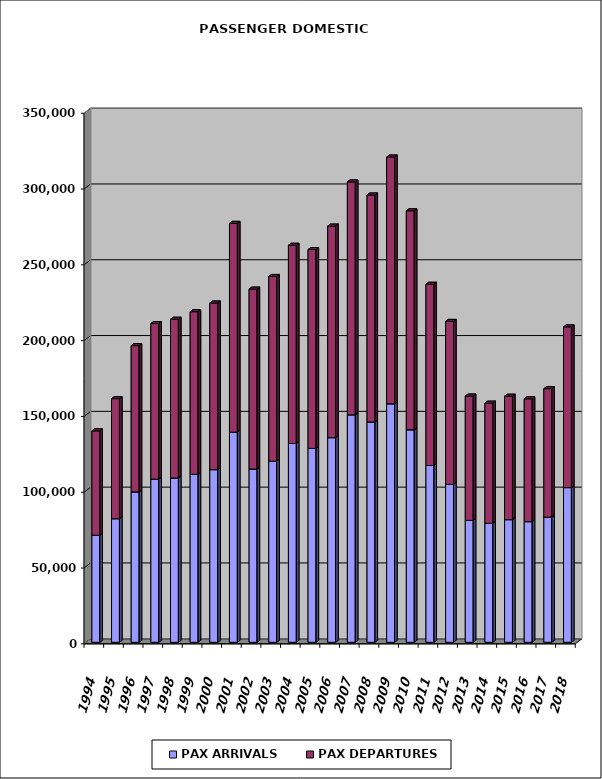
| Category | PAX ARRIVALS | PAX DEPARTURES |
|---|---|---|
| 1994.0 | 70668 | 68798 |
| 1995.0 | 81547 | 79173 |
| 1996.0 | 99252 | 96426 |
| 1997.0 | 107648 | 102615 |
| 1998.0 | 108400 | 104705 |
| 1999.0 | 110840 | 107228 |
| 2000.0 | 113909 | 109900 |
| 2001.0 | 138633 | 137721 |
| 2002.0 | 114356 | 118637 |
| 2003.0 | 119516 | 121807 |
| 2004.0 | 131155 | 130759 |
| 2005.0 | 127902 | 131187 |
| 2006.0 | 135000 | 139571 |
| 2007.0 | 150088 | 153602 |
| 2008.0 | 145352 | 149711 |
| 2009.0 | 157347 | 162756 |
| 2010.0 | 140196 | 144450 |
| 2011.0 | 116642 | 119532 |
| 2012.0 | 104197 | 107479 |
| 2013.0 | 80442 | 82011 |
| 2014.0 | 78506 | 79240 |
| 2015.0 | 80925 | 81410 |
| 2016.0 | 79603 | 81001 |
| 2017.0 | 82570 | 84754 |
| 2018.0 | 102057 | 105999 |